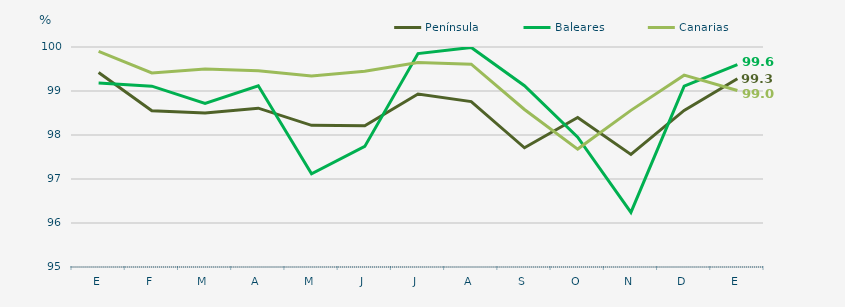
| Category | Península | Baleares | Canarias |
|---|---|---|---|
| E | 99.42 | 99.18 | 99.9 |
| F | 98.55 | 99.11 | 99.41 |
| M | 98.5 | 98.72 | 99.5 |
| A | 98.61 | 99.12 | 99.46 |
| M | 98.22 | 97.12 | 99.34 |
| J | 98.21 | 97.74 | 99.45 |
| J | 98.93 | 99.85 | 99.65 |
| A | 98.76 | 99.99 | 99.61 |
| S | 97.71 | 99.12 | 98.58 |
| O | 98.4 | 97.95 | 97.68 |
| N | 97.56 | 96.24 | 98.56 |
| D | 98.56 | 99.11 | 99.36 |
| E | 99.28 | 99.6 | 99.01 |